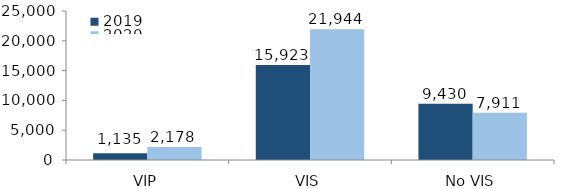
| Category | 2019 | 2020 |
|---|---|---|
| VIP | 1135 | 2178 |
| VIS | 15923 | 21944 |
| No VIS | 9430 | 7911 |